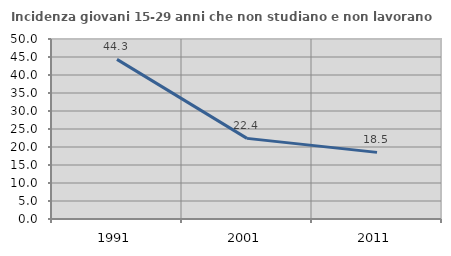
| Category | Incidenza giovani 15-29 anni che non studiano e non lavorano  |
|---|---|
| 1991.0 | 44.349 |
| 2001.0 | 22.394 |
| 2011.0 | 18.508 |